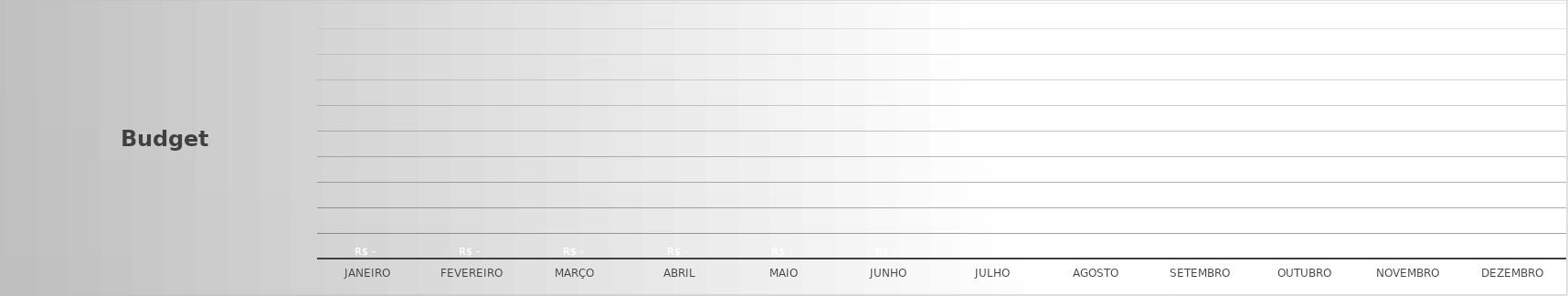
| Category |  R$ -    |
|---|---|
| Janeiro | 0 |
| Fevereiro | 0 |
| Março | 0 |
| Abril | 0 |
| Maio | 0 |
| Junho | 0 |
| Julho | 0 |
| Agosto | 0 |
| Setembro | 0 |
| Outubro | 0 |
| Novembro | 0 |
| Dezembro | 0 |